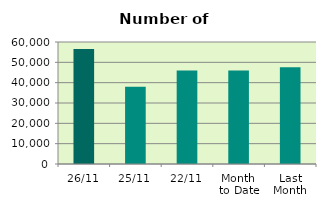
| Category | Series 0 |
|---|---|
| 26/11 | 56524 |
| 25/11 | 37950 |
| 22/11 | 45952 |
| Month 
to Date | 45942.889 |
| Last
Month | 47528 |